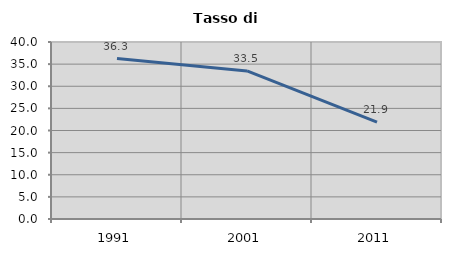
| Category | Tasso di disoccupazione   |
|---|---|
| 1991.0 | 36.257 |
| 2001.0 | 33.472 |
| 2011.0 | 21.894 |